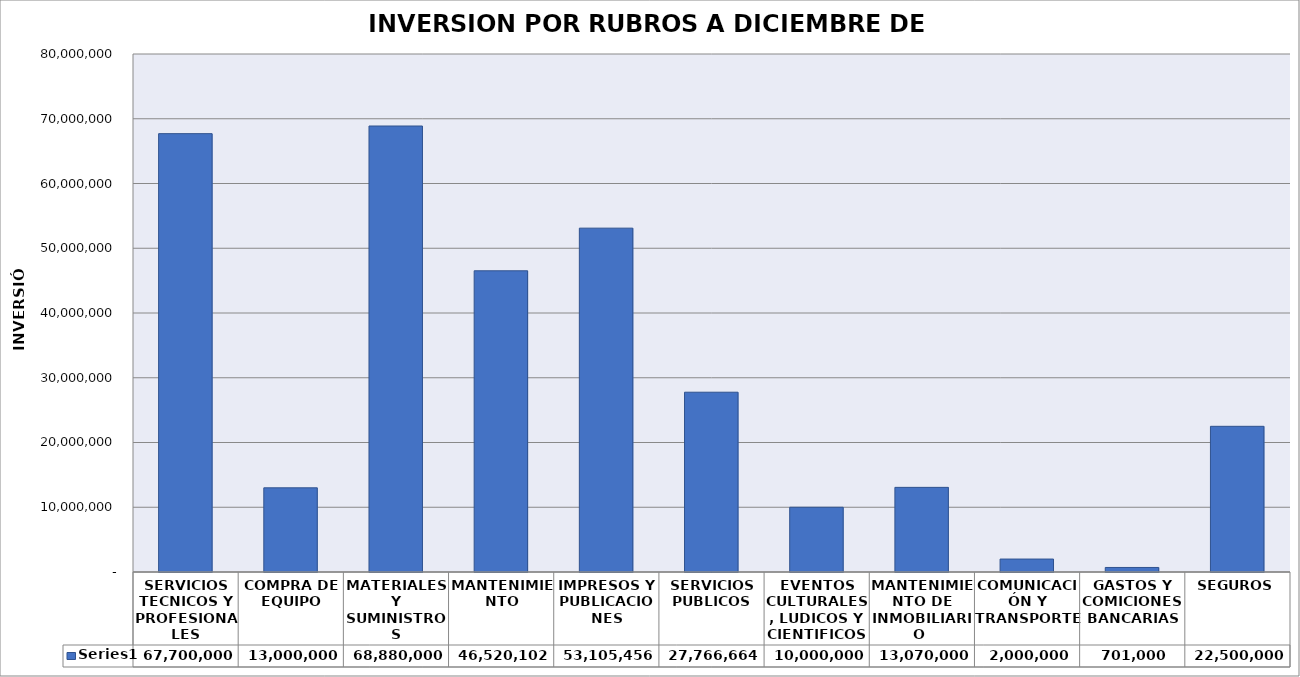
| Category | Series 0 |
|---|---|
| SERVICIOS TECNICOS Y PROFESIONALES | 67700000 |
| COMPRA DE EQUIPO | 13000000 |
| MATERIALES Y SUMINISTROS | 68880000 |
| MANTENIMIENTO | 46520102 |
| IMPRESOS Y PUBLICACIONES | 53105456 |
| SERVICIOS PUBLICOS | 27766664 |
| EVENTOS CULTURALES, LUDICOS Y CIENTIFICOS | 10000000 |
| MANTENIMIENTO DE INMOBILIARIO  | 13070000 |
| COMUNICACIÓN Y TRANSPORTE  | 2000000 |
| GASTOS Y COMICIONES BANCARIAS | 701000 |
| SEGUROS | 22500000 |